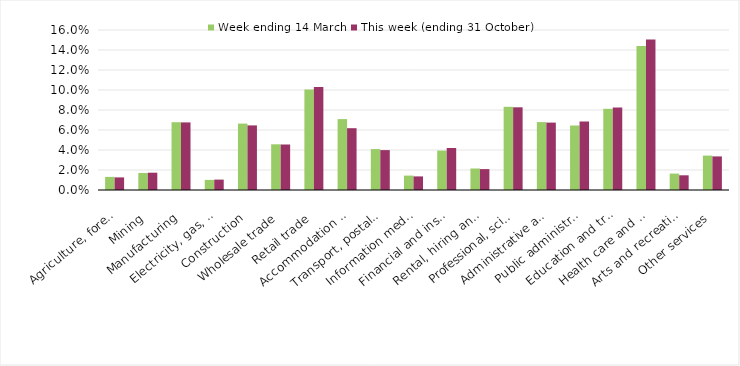
| Category | Week ending 14 March | This week (ending 31 October) |
|---|---|---|
| Agriculture, forestry and fishing | 0.013 | 0.013 |
| Mining | 0.017 | 0.017 |
| Manufacturing | 0.068 | 0.068 |
| Electricity, gas, water and waste services | 0.01 | 0.01 |
| Construction | 0.066 | 0.065 |
| Wholesale trade | 0.046 | 0.046 |
| Retail trade | 0.101 | 0.103 |
| Accommodation and food services | 0.071 | 0.062 |
| Transport, postal and warehousing | 0.041 | 0.04 |
| Information media and telecommunications | 0.014 | 0.014 |
| Financial and insurance services | 0.039 | 0.042 |
| Rental, hiring and real estate services | 0.022 | 0.021 |
| Professional, scientific and technical services | 0.083 | 0.083 |
| Administrative and support services | 0.068 | 0.067 |
| Public administration and safety | 0.064 | 0.068 |
| Education and training | 0.081 | 0.082 |
| Health care and social assistance | 0.144 | 0.15 |
| Arts and recreation services | 0.016 | 0.015 |
| Other services | 0.034 | 0.034 |